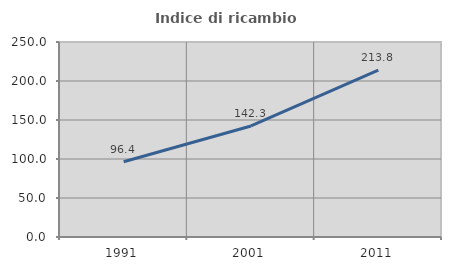
| Category | Indice di ricambio occupazionale  |
|---|---|
| 1991.0 | 96.41 |
| 2001.0 | 142.331 |
| 2011.0 | 213.816 |